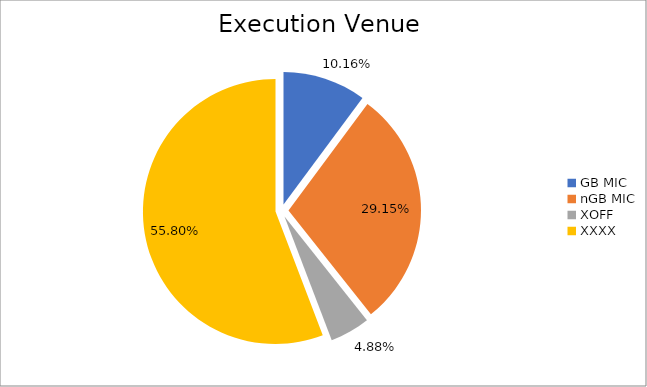
| Category | Series 0 |
|---|---|
| GB MIC | 923172.197 |
| nGB MIC | 2648559.792 |
| XOFF | 443467.353 |
| XXXX | 5069795.201 |